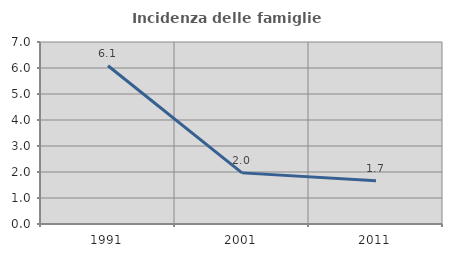
| Category | Incidenza delle famiglie numerose |
|---|---|
| 1991.0 | 6.087 |
| 2001.0 | 1.966 |
| 2011.0 | 1.667 |